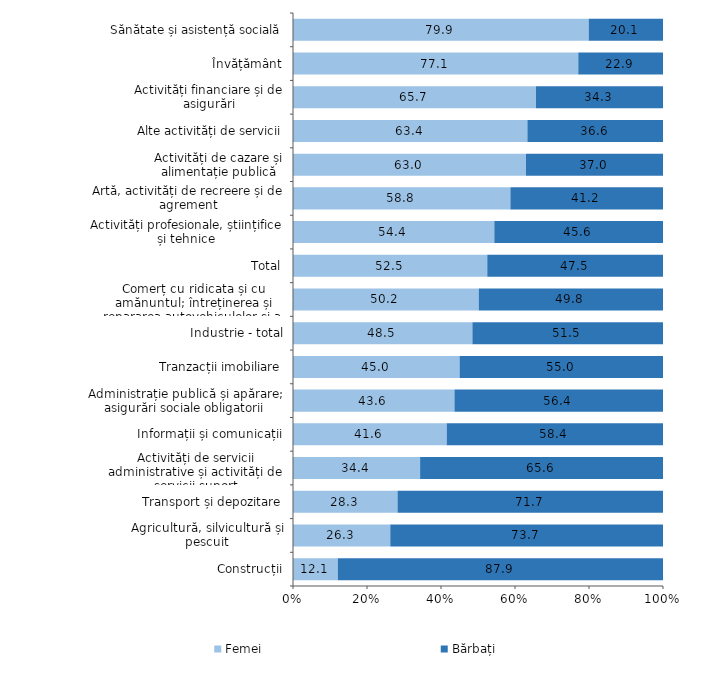
| Category | Femei | Bărbați |
|---|---|---|
| Construcții | 12.106 | 87.894 |
| Agricultură, silvicultură și pescuit | 26.294 | 73.706 |
| Transport și depozitare | 28.257 | 71.743 |
| Activități de servicii administrative și activități de servicii suport | 34.352 | 65.648 |
| Informații și comunicații | 41.557 | 58.443 |
| Administrație publică și apărare; asigurări sociale obligatorii | 43.637 | 56.363 |
| Tranzacții imobiliare | 45.026 | 54.974 |
| Industrie - total | 48.488 | 51.512 |
| Comerț cu ridicata și cu amănuntul; întreținerea și repararea autovehiculelor și a motocicletelor | 50.201 | 49.799 |
| Total | 52.506 | 47.494 |
| Activități profesionale, științifice și tehnice | 54.413 | 45.587 |
| Artă, activități de recreere și de agrement | 58.757 | 41.243 |
| Activități de cazare și alimentație publică | 62.965 | 37.035 |
| Alte activități de servicii | 63.352 | 36.648 |
| Activități financiare și de asigurări | 65.657 | 34.343 |
| Învățământ | 77.103 | 22.897 |
| Sănătate și asistență socială | 79.92 | 20.08 |